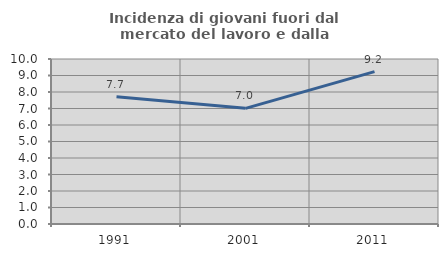
| Category | Incidenza di giovani fuori dal mercato del lavoro e dalla formazione  |
|---|---|
| 1991.0 | 7.712 |
| 2001.0 | 7.01 |
| 2011.0 | 9.232 |